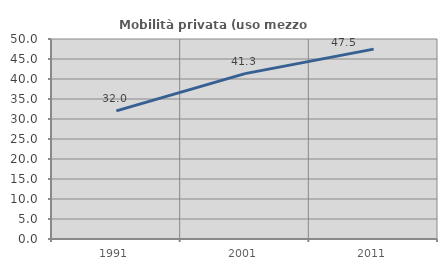
| Category | Mobilità privata (uso mezzo privato) |
|---|---|
| 1991.0 | 32.043 |
| 2001.0 | 41.345 |
| 2011.0 | 47.463 |